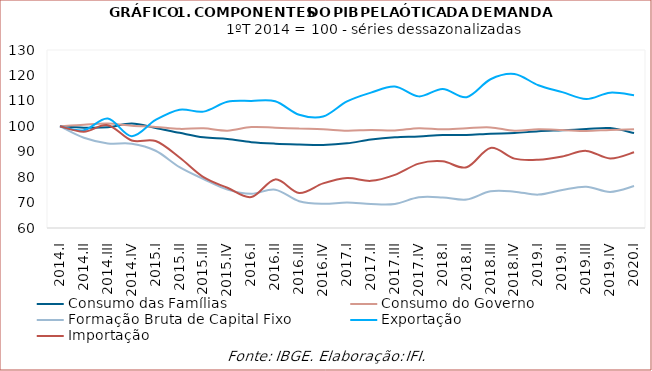
| Category | Consumo das Famílias | Consumo do Governo | Formação Bruta de Capital Fixo | Exportação | Importação |
|---|---|---|---|---|---|
| 2014.I | 100 | 100 | 100 | 100 | 100 |
| 2014.II | 99.451 | 100.648 | 95.479 | 98.444 | 97.853 |
| 2014.III | 99.597 | 101.077 | 93.275 | 103.066 | 100.432 |
| 2014.IV | 101.067 | 100.233 | 93.136 | 96.102 | 94.419 |
| 2015.I | 99.338 | 99.764 | 90.372 | 102.495 | 94.19 |
| 2015.II | 97.424 | 98.988 | 83.926 | 106.534 | 87.714 |
| 2015.III | 95.665 | 99.181 | 79.265 | 105.761 | 79.985 |
| 2015.IV | 94.977 | 98.286 | 75.105 | 109.644 | 75.843 |
| 2016.I | 93.753 | 99.68 | 73.468 | 109.972 | 72.168 |
| 2016.II | 93.162 | 99.457 | 75.057 | 109.824 | 79.116 |
| 2016.III | 92.858 | 99.114 | 70.546 | 104.526 | 73.798 |
| 2016.IV | 92.679 | 98.853 | 69.499 | 103.824 | 77.554 |
| 2017.I | 93.292 | 98.246 | 70.001 | 109.759 | 79.666 |
| 2017.II | 94.771 | 98.57 | 69.463 | 113.227 | 78.542 |
| 2017.III | 95.653 | 98.376 | 69.48 | 115.598 | 80.901 |
| 2017.IV | 95.988 | 99.245 | 72.097 | 111.763 | 85.33 |
| 2018.I | 96.544 | 98.804 | 72.033 | 114.689 | 86.217 |
| 2018.II | 96.602 | 99.247 | 71.183 | 111.455 | 83.868 |
| 2018.III | 97.094 | 99.544 | 74.41 | 118.494 | 91.481 |
| 2018.IV | 97.332 | 98.248 | 74.296 | 120.548 | 87.275 |
| 2019.I | 98.038 | 98.835 | 73.127 | 116.135 | 86.864 |
| 2019.II | 98.442 | 98.549 | 74.945 | 113.43 | 88.14 |
| 2019.III | 98.894 | 98.167 | 76.236 | 110.711 | 90.326 |
| 2019.IV | 99.309 | 98.577 | 74.187 | 113.219 | 87.327 |
| 2020.I | 97.337 | 98.813 | 76.482 | 112.184 | 89.781 |